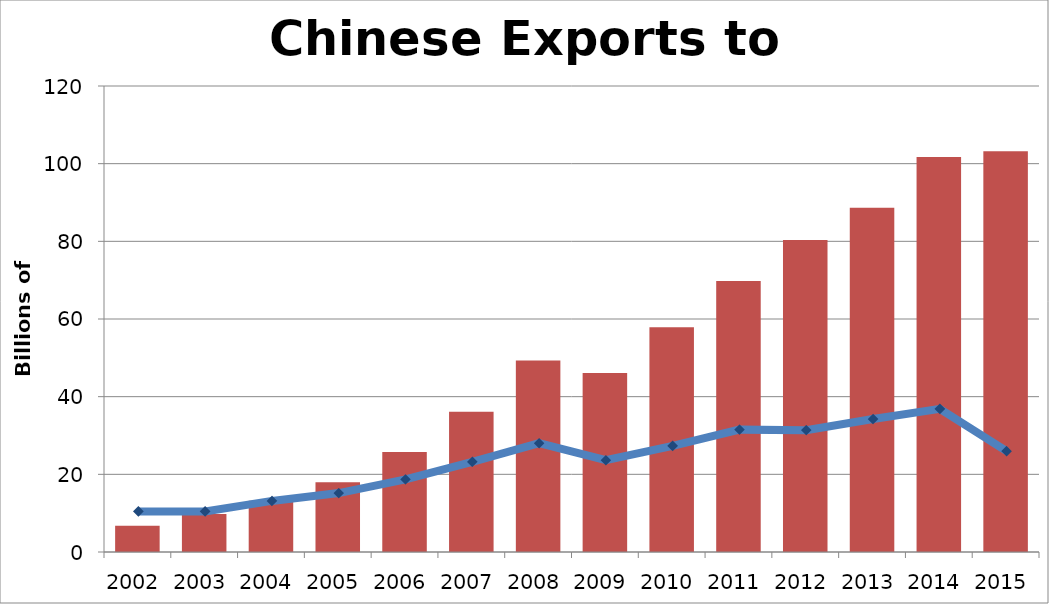
| Category | Series 0 |
|---|---|
| 2002.0 | 6.736 |
| 2003.0 | 9.803 |
| 2004.0 | 13.22 |
| 2005.0 | 17.931 |
| 2006.0 | 25.781 |
| 2007.0 | 36.145 |
| 2008.0 | 49.341 |
| 2009.0 | 46.101 |
| 2010.0 | 57.875 |
| 2011.0 | 69.809 |
| 2012.0 | 80.343 |
| 2013.0 | 88.625 |
| 2014.0 | 101.699 |
| 2015.0 | 103.191 |